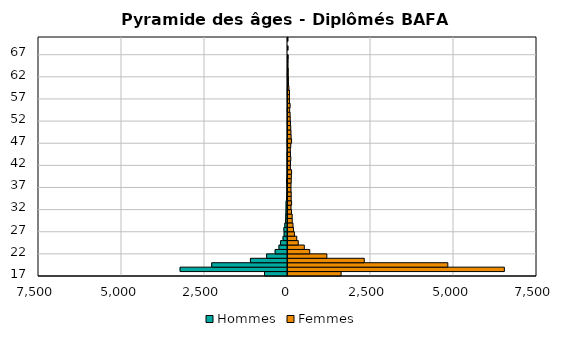
| Category | Hommes | Femmes |
|---|---|---|
| 17.0 | -692 | 1600 |
| 18.0 | -3235 | 6517 |
| 19.0 | -2283 | 4814 |
| 20.0 | -1116 | 2297 |
| 21.0 | -629 | 1170 |
| 22.0 | -372 | 654 |
| 23.0 | -257 | 491 |
| 24.0 | -208 | 309 |
| 25.0 | -133 | 264 |
| 26.0 | -101 | 193 |
| 27.0 | -107 | 166 |
| 28.0 | -80 | 151 |
| 29.0 | -58 | 127 |
| 30.0 | -53 | 126 |
| 31.0 | -47 | 106 |
| 32.0 | -44 | 91 |
| 33.0 | -42 | 108 |
| 34.0 | -30 | 96 |
| 35.0 | -21 | 97 |
| 36.0 | -18 | 91 |
| 37.0 | -22 | 91 |
| 38.0 | -30 | 97 |
| 39.0 | -16 | 101 |
| 40.0 | -11 | 108 |
| 41.0 | -13 | 72 |
| 42.0 | -11 | 75 |
| 43.0 | -14 | 85 |
| 44.0 | -14 | 75 |
| 45.0 | -6 | 69 |
| 46.0 | -10 | 84 |
| 47.0 | -13 | 108 |
| 48.0 | -6 | 94 |
| 49.0 | -6 | 89 |
| 50.0 | -4 | 82 |
| 51.0 | -8 | 74 |
| 52.0 | -5 | 67 |
| 53.0 | -3 | 64 |
| 54.0 | -6 | 50 |
| 55.0 | -1 | 64 |
| 56.0 | -4 | 44 |
| 57.0 | -3 | 43 |
| 58.0 | -5 | 45 |
| 59.0 | -2 | 27 |
| 60.0 | 0 | 15 |
| 61.0 | -1 | 13 |
| 62.0 | -4 | 4 |
| 63.0 | -1 | 5 |
| 64.0 | 0 | 1 |
| 65.0 | 0 | 3 |
| 66.0 | -1 | 1 |
| 67.0 | 0 | 0 |
| 68.0 | 0 | 3 |
| 69.0 | 0 | 0 |
| 70.0 | -1 | 0 |